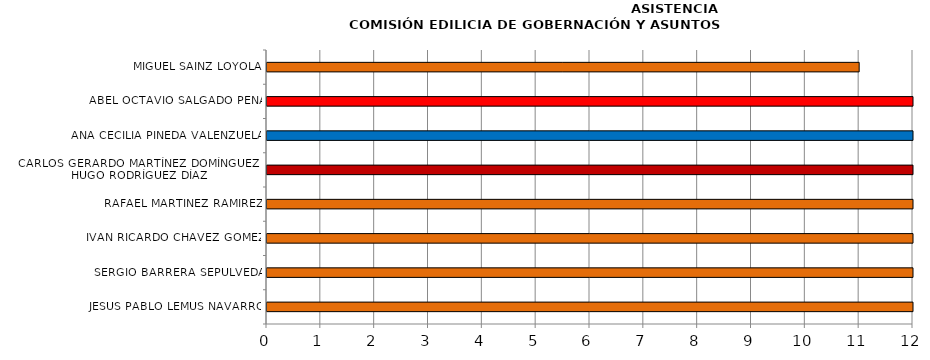
| Category | Series 0 |
|---|---|
| JESÚS PABLO LEMUS NAVARRO | 12 |
| SERGIO BARRERA SEPÚLVEDA | 12 |
| IVÁN RICARDO CHÁVEZ GÓMEZ | 12 |
| RAFAEL MARTÍNEZ RAMÍREZ | 12 |
| CARLOS GERARDO MARTÍNEZ DOMÍNGUEZ /
HUGO RODRÍGUEZ DÍAZ | 12 |
| ANA CECILIA PINEDA VALENZUELA | 12 |
| ABEL OCTAVIO SALGADO PEÑA | 12 |
| MIGUEL SAINZ LOYOLA | 11 |